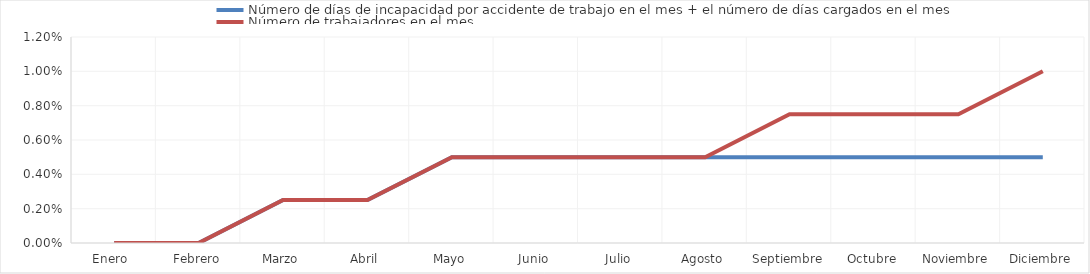
| Category | Número de días de incapacidad por accidente de trabajo en el mes + el número de días cargados en el mes | Número de trabajadores en el mes |
|---|---|---|
| Enero  | 0 | 0 |
| Febrero | 0 | 0 |
| Marzo | 0.002 | 0.002 |
| Abril | 0.002 | 0.002 |
| Mayo | 0.005 | 0.005 |
| Junio | 0.005 | 0.005 |
| Julio | 0.005 | 0.005 |
| Agosto | 0.005 | 0.005 |
| Septiembre | 0.005 | 0.008 |
| Octubre | 0.005 | 0.008 |
| Noviembre | 0.005 | 0.008 |
| Diciembre | 0.005 | 0.01 |